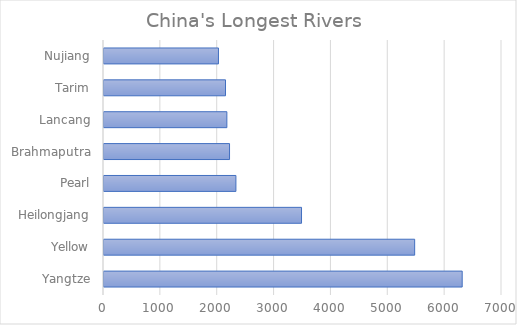
| Category | Series 0 |
|---|---|
| Yangtze | 6300 |
| Yellow | 5464 |
| Heilongjang | 3474 |
| Pearl | 2320 |
| Brahmaputra | 2208 |
| Lancang | 2161 |
| Tarim | 2137 |
| Nujiang | 2013 |